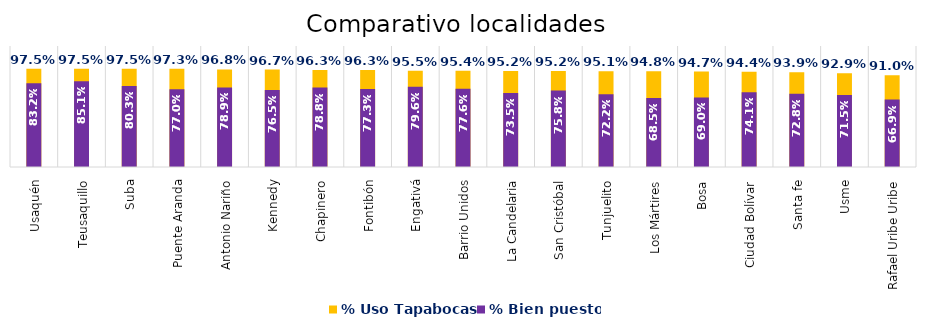
| Category | % Uso Tapabocas | % Bien puesto |
|---|---|---|
| Usaquén | 0.975 | 0.832 |
| Teusaquillo | 0.975 | 0.851 |
| Suba | 0.975 | 0.803 |
| Puente Aranda | 0.973 | 0.77 |
| Antonio Nariño | 0.968 | 0.789 |
| Kennedy | 0.967 | 0.765 |
| Chapinero | 0.963 | 0.788 |
| Fontibón | 0.963 | 0.773 |
| Engativá | 0.955 | 0.796 |
| Barrio Unidos | 0.954 | 0.776 |
| La Candelaria | 0.952 | 0.735 |
| San Cristóbal | 0.952 | 0.758 |
| Tunjuelito | 0.951 | 0.722 |
| Los Mártires | 0.948 | 0.685 |
| Bosa | 0.947 | 0.69 |
| Ciudad Bolívar | 0.944 | 0.741 |
| Santa fe | 0.939 | 0.728 |
| Usme | 0.929 | 0.715 |
| Rafael Uribe Uribe | 0.91 | 0.669 |